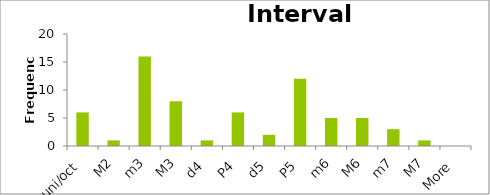
| Category | Frequency |
|---|---|
| uni/oct | 6 |
| M2 | 1 |
| m3 | 16 |
| M3 | 8 |
| d4 | 1 |
| P4 | 6 |
| d5 | 2 |
| P5 | 12 |
| m6 | 5 |
| M6 | 5 |
| m7 | 3 |
| M7 | 1 |
| More | 0 |